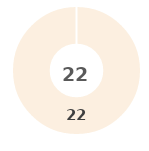
| Category | Series 0 |
|---|---|
| 0 | 0 |
| 1 | 0 |
| 2 | 0 |
| 3 | 0 |
| 4 | 22 |